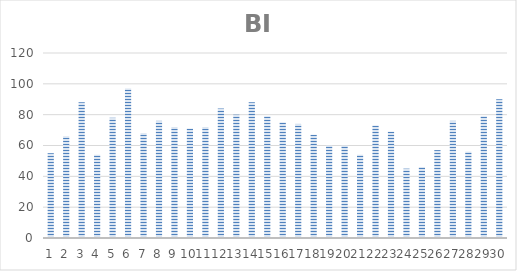
| Category | BI |
|---|---|
| 0 | 55 |
| 1 | 66 |
| 2 | 88 |
| 3 | 54 |
| 4 | 78 |
| 5 | 97 |
| 6 | 68 |
| 7 | 76 |
| 8 | 72 |
| 9 | 71 |
| 10 | 72 |
| 11 | 84 |
| 12 | 80 |
| 13 | 88 |
| 14 | 79 |
| 15 | 75 |
| 16 | 74 |
| 17 | 67 |
| 18 | 60 |
| 19 | 60 |
| 20 | 54 |
| 21 | 73 |
| 22 | 69 |
| 23 | 45 |
| 24 | 46 |
| 25 | 57 |
| 26 | 76 |
| 27 | 56 |
| 28 | 79 |
| 29 | 90 |